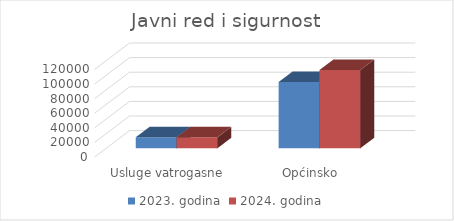
| Category | 2023. godina | 2024. godina |
|---|---|---|
| Usluge vatrogasne zaštite | 15000 | 15000 |
| Općinsko pravobranilaštvo | 90695 | 107220 |